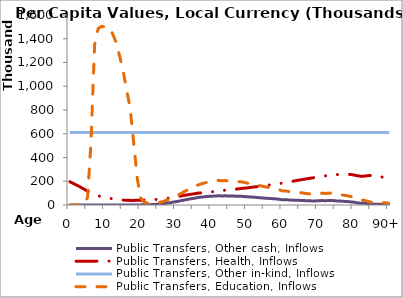
| Category | Public Transfers, Other cash, Inflows | Public Transfers, Health, Inflows | Public Transfers, Other in-kind, Inflows | Public Transfers, Education, Inflows |
|---|---|---|---|---|
| 0 | 0 | 195867.454 | 610097.509 | 0 |
|  | 0 | 181082.888 | 610097.509 | 0 |
| 2 | 0 | 166298.321 | 610097.509 | 0 |
| 3 | 0 | 150491.358 | 610097.509 | 0 |
| 4 | 0 | 133750.358 | 610097.509 | 0 |
| 5 | 0 | 116957.086 | 610097.509 | 64156.155 |
| 6 | 0 | 100922.7 | 610097.509 | 534427.511 |
| 7 | 0 | 87995.321 | 610097.509 | 1349090.03 |
| 8 | 0 | 77732.658 | 610097.509 | 1486770.699 |
| 9 | 0 | 69485.082 | 610097.509 | 1504009.829 |
| 10 | 0 | 63156.59 | 610097.509 | 1500863.329 |
| 11 | 0 | 57413.386 | 610097.509 | 1497990.813 |
| 12 | 0 | 52511.094 | 610097.509 | 1446098.176 |
| 13 | 0 | 48112.748 | 610097.509 | 1373871.948 |
| 14 | 0 | 44431.833 | 610097.509 | 1258164.702 |
| 15 | 229.911 | 41466.171 | 610097.509 | 1135448.264 |
| 16 | 318.977 | 39556.471 | 610097.509 | 969819.649 |
| 17 | 618.991 | 38776.111 | 610097.509 | 819030.805 |
| 18 | 696.401 | 38754.008 | 610097.509 | 524238.151 |
| 19 | 917.843 | 39299.535 | 610097.509 | 226914.412 |
| 20 | 1037.66 | 40260.71 | 610097.509 | 57073.266 |
| 21 | 1561.203 | 41728.609 | 610097.509 | 24625.263 |
| 22 | 2153.819 | 42823.409 | 610097.509 | 14759.509 |
| 23 | 3379.992 | 44245.623 | 610097.509 | 16176.28 |
| 24 | 4965.109 | 45920.632 | 610097.509 | 16036.555 |
| 25 | 6794.405 | 48065.853 | 610097.509 | 18159.432 |
| 26 | 9848.303 | 50780.774 | 610097.509 | 26548.33 |
| 27 | 14138.719 | 54772.647 | 610097.509 | 37747.308 |
| 28 | 17960.336 | 58835.703 | 610097.509 | 47952.226 |
| 29 | 23753.271 | 64152.796 | 610097.509 | 63550.129 |
| 30 | 28477.905 | 68667.901 | 610097.509 | 75961.072 |
| 31 | 34246.278 | 74096.284 | 610097.509 | 91333.717 |
| 32 | 40845.387 | 79853.799 | 610097.509 | 108920.195 |
| 33 | 46563.777 | 84832.841 | 610097.509 | 124159.867 |
| 34 | 52017.945 | 89792.01 | 610097.509 | 138695.567 |
| 35 | 56056.56 | 93987.336 | 610097.509 | 149459.241 |
| 36 | 62586.244 | 99152.756 | 610097.509 | 166861.182 |
| 37 | 66423.406 | 102578.098 | 610097.509 | 177088.344 |
| 38 | 69704.092 | 105947.776 | 610097.509 | 185832.882 |
| 39 | 72527.361 | 108754.647 | 610097.509 | 193358.751 |
| 40 | 73444.452 | 111055.902 | 610097.509 | 195805.272 |
| 41 | 76109.425 | 114615.998 | 610097.509 | 202909.792 |
| 42 | 77455.25 | 118349.697 | 610097.509 | 206499.155 |
| 43 | 76493.355 | 121291.613 | 610097.509 | 203938.906 |
| 44 | 77271.389 | 125551.185 | 610097.509 | 206015.262 |
| 45 | 75376.518 | 128275.458 | 610097.509 | 200969.182 |
| 46 | 75700.831 | 132020.143 | 610097.509 | 201836.935 |
| 47 | 74082.757 | 134457.519 | 610097.509 | 197529.336 |
| 48 | 73390.313 | 138004.426 | 610097.509 | 195689.427 |
| 49 | 71973.099 | 141165.779 | 610097.509 | 191919.181 |
| 50 | 69037.449 | 144113.712 | 610097.509 | 184103.114 |
| 51 | 67521.162 | 148006.155 | 610097.509 | 180069.931 |
| 52 | 65306.627 | 151863.003 | 610097.509 | 174176.729 |
| 53 | 62595.101 | 155478.316 | 610097.509 | 166959.736 |
| 54 | 60021.105 | 159260.017 | 610097.509 | 160109.752 |
| 55 | 57358.851 | 163072.985 | 610097.509 | 153025.455 |
| 56 | 55721.171 | 167523.114 | 610097.509 | 148672.689 |
| 57 | 53286.837 | 171583.407 | 610097.509 | 142195.737 |
| 58 | 51645.849 | 176669.21 | 610097.509 | 137829.652 |
| 59 | 47732.932 | 180552.661 | 610097.509 | 127406.867 |
| 60 | 44459.1 | 184869.064 | 610097.509 | 118687.243 |
| 61 | 44011.942 | 190837.502 | 610097.509 | 117499.69 |
| 62 | 42116.407 | 196070.836 | 610097.509 | 112453.544 |
| 63 | 40670.54 | 201037.634 | 610097.509 | 108607.997 |
| 64 | 40536.895 | 206824.091 | 610097.509 | 108261.289 |
| 65 | 38675.128 | 211727.084 | 610097.509 | 103309.672 |
| 66 | 37355.332 | 216769.563 | 610097.509 | 99802.677 |
| 67 | 35654.455 | 221634.022 | 610097.509 | 95282.657 |
| 68 | 34803.847 | 226435.274 | 610097.509 | 93032.279 |
| 69 | 33960.682 | 231341.982 | 610097.509 | 90805.797 |
| 70 | 36078.16 | 237332.147 | 610097.509 | 96471.851 |
| 71 | 37113.747 | 241997.292 | 610097.509 | 99259.071 |
| 72 | 36430.808 | 245309.126 | 610097.509 | 97471.232 |
| 73 | 37282.276 | 249387.345 | 610097.509 | 99776.801 |
| 74 | 37691.305 | 253012.89 | 610097.509 | 100909.215 |
| 75 | 34612.789 | 254998.967 | 610097.509 | 92756.961 |
| 76 | 33659.667 | 257986.117 | 610097.509 | 90279.37 |
| 77 | 30952.521 | 259668.988 | 610097.509 | 83142.056 |
| 78 | 29374.783 | 259055.233 | 610097.509 | 79033.94 |
| 79 | 26903.794 | 257634.382 | 610097.509 | 72571.69 |
| 80 | 23621.384 | 252864.029 | 610097.509 | 63984.338 |
| 81 | 18747.941 | 246667.052 | 610097.509 | 51215.377 |
| 82 | 14664.29 | 241995.096 | 610097.509 | 40613.107 |
| 83 | 13968.634 | 243309.691 | 610097.509 | 39094.021 |
| 84 | 10873.639 | 247243.532 | 610097.509 | 31245.815 |
| 85 | 7574.844 | 248739.581 | 610097.509 | 23001.226 |
| 86 | 6731.888 | 250621.191 | 610097.509 | 21513.381 |
| 87 | 5888.932 | 244398.249 | 610097.509 | 20310.555 |
| 88 | 5045.976 | 234977.692 | 610097.509 | 19519.153 |
| 89 | 4203.02 | 219639.719 | 610097.509 | 19340.395 |
| 90+ | 3360.064 | 210129.673 | 610097.509 | 12562.997 |